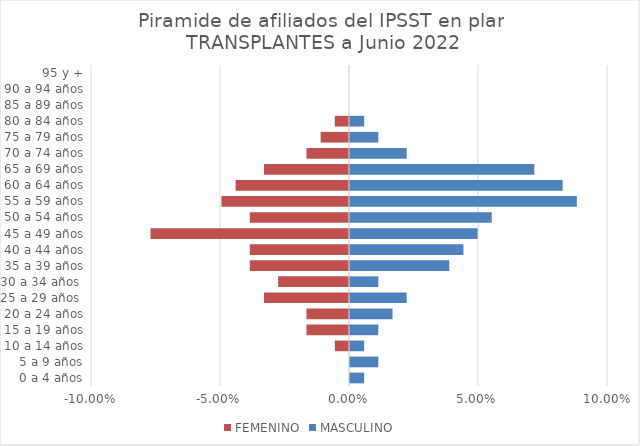
| Category | FEMENINO | MASCULINO |
|---|---|---|
| 0 a 4 años | 0 | 0.005 |
| 5 a 9 años | 0 | 0.011 |
| 10 a 14 años | -0.005 | 0.005 |
| 15 a 19 años | -0.016 | 0.011 |
| 20 a 24 años | -0.016 | 0.016 |
| 25 a 29 años  | -0.033 | 0.022 |
| 30 a 34 años  | -0.027 | 0.011 |
| 35 a 39 años | -0.038 | 0.038 |
| 40 a 44 años | -0.038 | 0.044 |
| 45 a 49 años | -0.077 | 0.049 |
| 50 a 54 años | -0.038 | 0.055 |
| 55 a 59 años | -0.049 | 0.088 |
| 60 a 64 años | -0.044 | 0.082 |
| 65 a 69 años | -0.033 | 0.071 |
| 70 a 74 años | -0.016 | 0.022 |
| 75 a 79 años | -0.011 | 0.011 |
| 80 a 84 años | -0.005 | 0.005 |
| 85 a 89 años | 0 | 0 |
| 90 a 94 años | 0 | 0 |
| 95 y + | 0 | 0 |